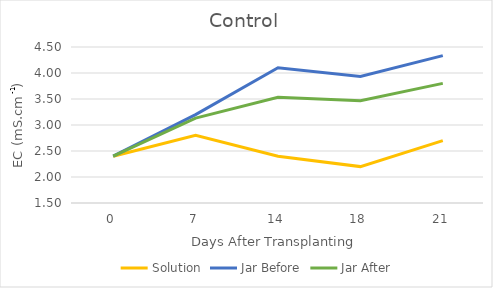
| Category | Solution | Jar Before | Jar After |
|---|---|---|---|
| 0.0 | 2.4 | 2.4 | 2.4 |
| 7.0 | 2.8 | 3.2 | 3.133 |
| 14.0 | 2.4 | 4.1 | 3.533 |
| 18.0 | 2.2 | 3.933 | 3.467 |
| 21.0 | 2.7 | 4.333 | 3.8 |